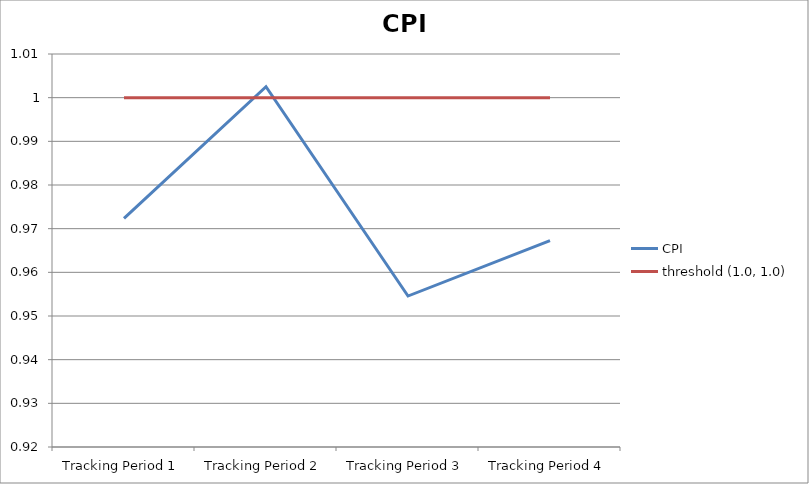
| Category | CPI | threshold (1.0, 1.0) |
|---|---|---|
| Tracking Period 1 | 0.972 | 1 |
| Tracking Period 2 | 1.003 | 1 |
| Tracking Period 3 | 0.955 | 1 |
| Tracking Period 4 | 0.967 | 1 |